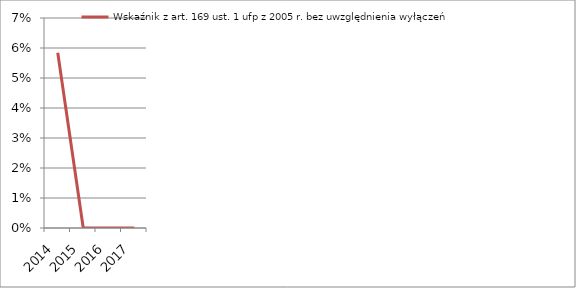
| Category | Wskaźnik z art. 169 ust. 1 ufp z 2005 r. bez uwzględnienia wyłączeń |
|---|---|
| 2014.0 | 0.058 |
| 2015.0 | 0 |
| 2016.0 | 0 |
| 2017.0 | 0 |